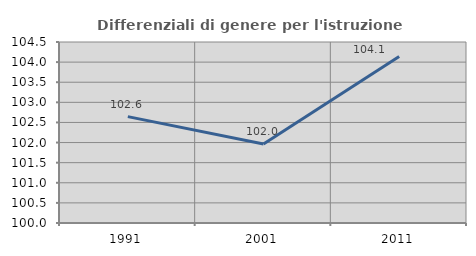
| Category | Differenziali di genere per l'istruzione superiore |
|---|---|
| 1991.0 | 102.645 |
| 2001.0 | 101.963 |
| 2011.0 | 104.141 |